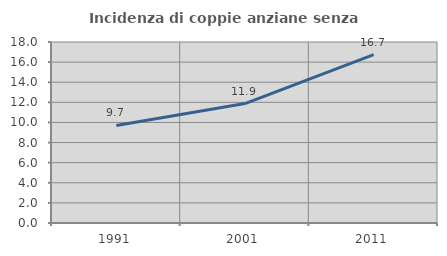
| Category | Incidenza di coppie anziane senza figli  |
|---|---|
| 1991.0 | 9.7 |
| 2001.0 | 11.875 |
| 2011.0 | 16.738 |